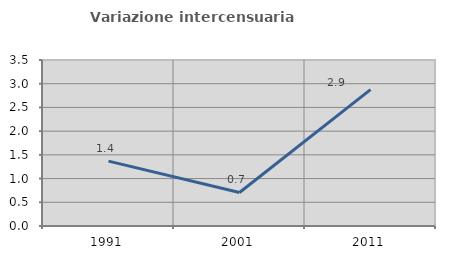
| Category | Variazione intercensuaria annua |
|---|---|
| 1991.0 | 1.368 |
| 2001.0 | 0.707 |
| 2011.0 | 2.874 |